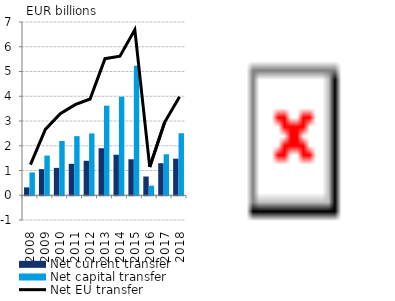
| Category | Net current transfer | Net capital transfer |
|---|---|---|
| 2008.0 | 0.318 | 0.921 |
| 2009.0 | 1.056 | 1.603 |
| 2010.0 | 1.106 | 2.193 |
| 2011.0 | 1.271 | 2.388 |
| 2012.0 | 1.393 | 2.497 |
| 2013.0 | 1.899 | 3.619 |
| 2014.0 | 1.637 | 3.983 |
| 2015.0 | 1.453 | 5.237 |
| 2016.0 | 0.757 | 0.387 |
| 2017.0 | 1.294 | 1.654 |
| 2018.0 | 1.478 | 2.505 |